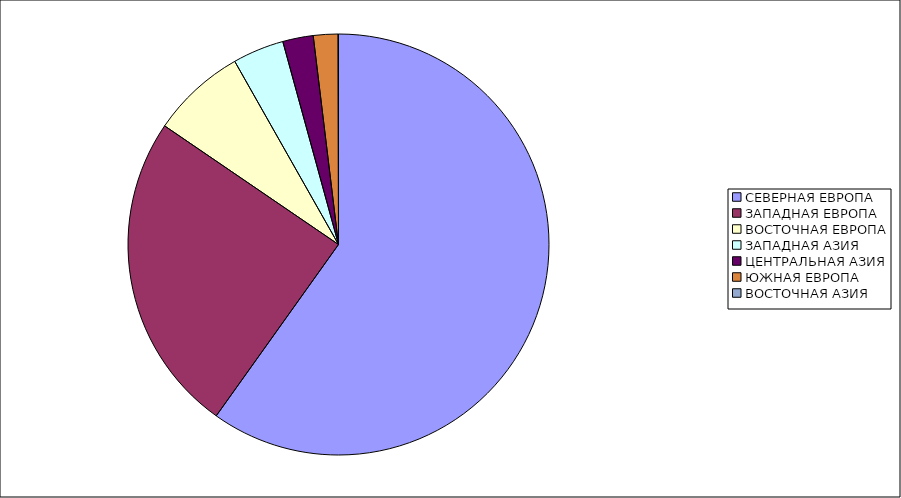
| Category | Оборот |
|---|---|
| СЕВЕРНАЯ ЕВРОПА | 59.863 |
| ЗАПАДНАЯ ЕВРОПА | 24.666 |
| ВОСТОЧНАЯ ЕВРОПА | 7.267 |
| ЗАПАДНАЯ АЗИЯ | 3.94 |
| ЦЕНТРАЛЬНАЯ АЗИЯ | 2.344 |
| ЮЖНАЯ ЕВРОПА | 1.891 |
| ВОСТОЧНАЯ АЗИЯ | 0.028 |